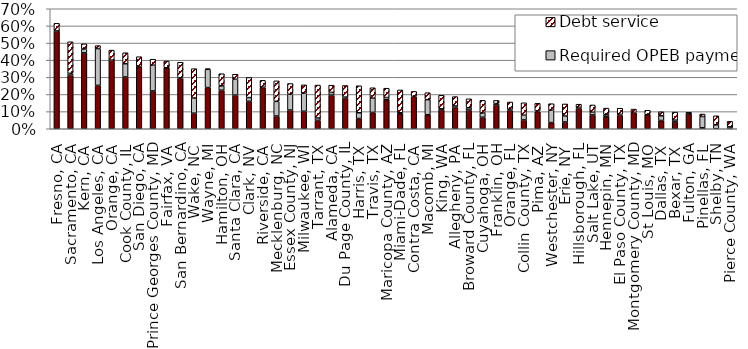
| Category | Required pension payments | Required OPEB payments | Debt service |
|---|---|---|---|
| Fresno, CA | 0.571 | 0 | 0.045 |
| Sacramento, CA | 0.312 | 0.011 | 0.184 |
| Kern, CA | 0.443 | 0.023 | 0.03 |
| Los Angeles, CA | 0.253 | 0.215 | 0.017 |
| Orange, CA | 0.4 | 0 | 0.058 |
| Cook County, IL | 0.302 | 0.077 | 0.064 |
| San Diego, CA | 0.363 | 0 | 0.057 |
| Prince Georges County, MD | 0.221 | 0.15 | 0.035 |
| Fairfax, VA | 0.356 | 0 | 0.039 |
| San Bernardino, CA | 0.295 | 0 | 0.092 |
| Wake, NC | 0.091 | 0.089 | 0.171 |
| Wayne, MI | 0.24 | 0.106 | 0.004 |
| Hamilton, OH | 0.225 | 0.025 | 0.071 |
| Santa Clara, CA | 0.196 | 0.092 | 0.029 |
| Clark, NV | 0.16 | 0.022 | 0.117 |
| Riverside, CA | 0.241 | 0.002 | 0.04 |
| Mecklenburg, NC | 0.074 | 0.086 | 0.12 |
| Essex County, NJ | 0.109 | 0.092 | 0.063 |
| Milwaukee, WI | 0.102 | 0.105 | 0.049 |
| Tarrant, TX | 0.049 | 0.014 | 0.192 |
| Alameda, CA | 0.196 | 0.016 | 0.042 |
| Du Page County, IL | 0.179 | 0.006 | 0.068 |
| Harris, TX | 0.06 | 0.033 | 0.158 |
| Travis, TX | 0.095 | 0.083 | 0.061 |
| Maricopa County, AZ | 0.169 | 0.013 | 0.054 |
| Miami-Dade, FL | 0.088 | 0.005 | 0.133 |
| Contra Costa, CA | 0.189 | 0 | 0.029 |
| Macomb, MI | 0.081 | 0.088 | 0.04 |
| King, WA | 0.11 | 0.006 | 0.079 |
| Allegheny, PA | 0.126 | 0.007 | 0.055 |
| Broward County, FL | 0.109 | 0.013 | 0.052 |
| Cuyahoga, OH | 0.067 | 0.025 | 0.074 |
| Franklin, OH | 0.139 | 0.008 | 0.018 |
| Orange, FL | 0.107 | 0.007 | 0.042 |
| Collin County, TX | 0.051 | 0.028 | 0.072 |
| Pima, AZ | 0.099 | 0.003 | 0.046 |
| Westchester, NY | 0.036 | 0.072 | 0.038 |
| Erie, NY | 0.04 | 0.035 | 0.07 |
| Hillsborough, FL | 0.12 | 0.005 | 0.018 |
| Salt Lake, UT | 0.081 | 0.016 | 0.042 |
| Hennepin, MN | 0.07 | 0.012 | 0.039 |
| El Paso County, TX | 0.079 | 0.005 | 0.036 |
| Montgomery County, MD | 0.096 | 0 | 0.019 |
| St Louis, MO | 0.082 | 0 | 0.026 |
| Dallas, TX | 0.048 | 0.027 | 0.023 |
| Bexar, TX | 0.04 | 0.01 | 0.047 |
| Fulton, GA | 0.087 | 0 | 0.009 |
| Pinellas, FL | 0.005 | 0.066 | 0.014 |
| Shelby, TN | 0 | 0.023 | 0.053 |
| Pierce County, WA | 0.002 | 0.009 | 0.032 |